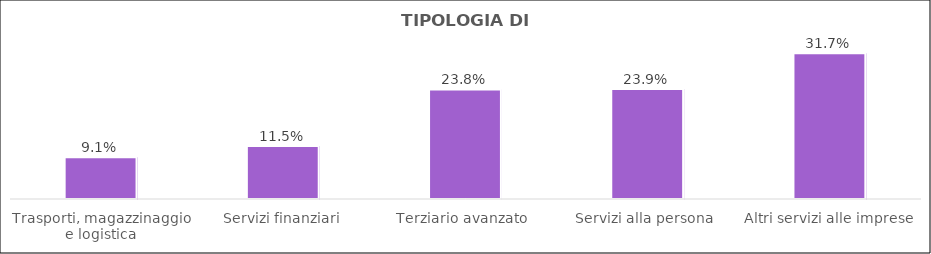
| Category | Series 0 |
|---|---|
| Trasporti, magazzinaggio e logistica | 0.091 |
| Servizi finanziari | 0.115 |
| Terziario avanzato  | 0.238 |
| Servizi alla persona  | 0.239 |
| Altri servizi alle imprese | 0.317 |